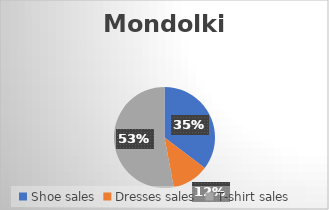
| Category | Mondolkiri |
|---|---|
| Shoe sales | 600 |
| Dresses sales | 200 |
| T-shirt sales | 900 |